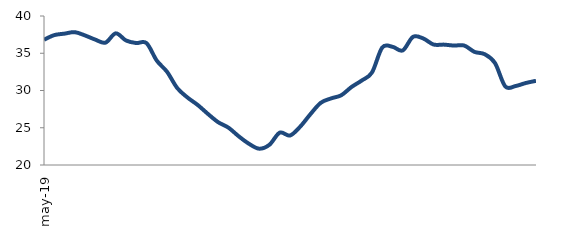
| Category | Series 0 |
|---|---|
| 2019-05-01 | 36.815 |
| 2019-06-01 | 37.435 |
| 2019-07-01 | 37.632 |
| 2019-08-01 | 37.831 |
| 2019-09-01 | 37.39 |
| 2019-10-01 | 36.831 |
| 2019-11-01 | 36.425 |
| 2019-12-01 | 37.671 |
| 2020-01-01 | 36.714 |
| 2020-02-01 | 36.369 |
| 2020-03-01 | 36.361 |
| 2020-04-01 | 34.017 |
| 2020-05-01 | 32.52 |
| 2020-06-01 | 30.328 |
| 2020-07-01 | 29.058 |
| 2020-08-01 | 28.052 |
| 2020-09-01 | 26.848 |
| 2020-10-01 | 25.737 |
| 2020-11-01 | 25.008 |
| 2020-12-01 | 23.848 |
| 2021-01-01 | 22.846 |
| 2021-02-01 | 22.188 |
| 2021-03-01 | 22.726 |
| 2021-04-01 | 24.345 |
| 2021-05-01 | 23.958 |
| 2021-06-01 | 25.156 |
| 2021-07-01 | 26.838 |
| 2021-08-01 | 28.346 |
| 2021-09-01 | 28.934 |
| 2021-10-01 | 29.363 |
| 2021-11-01 | 30.47 |
| 2021-12-01 | 31.341 |
| 2022-01-01 | 32.424 |
| 2022-02-01 | 35.771 |
| 2022-03-01 | 35.868 |
| 2022-04-01 | 35.381 |
| 2022-05-01 | 37.2 |
| 2022-06-01 | 36.986 |
| 2022-07-01 | 36.172 |
| 2022-08-01 | 36.157 |
| 2022-09-01 | 36.033 |
| 2022-10-01 | 36.034 |
| 2022-11-01 | 35.183 |
| 2022-12-01 | 34.87 |
| 2023-01-01 | 33.684 |
| 2023-02-01 | 30.55 |
| 2023-03-01 | 30.596 |
| 2023-04-01 | 31.004 |
| 2023-05-01 | 31.3 |